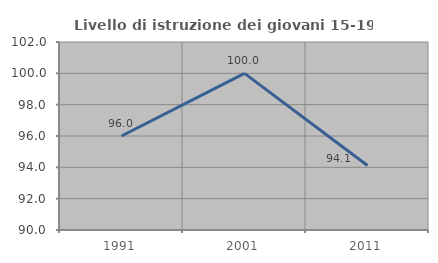
| Category | Livello di istruzione dei giovani 15-19 anni |
|---|---|
| 1991.0 | 96 |
| 2001.0 | 100 |
| 2011.0 | 94.118 |